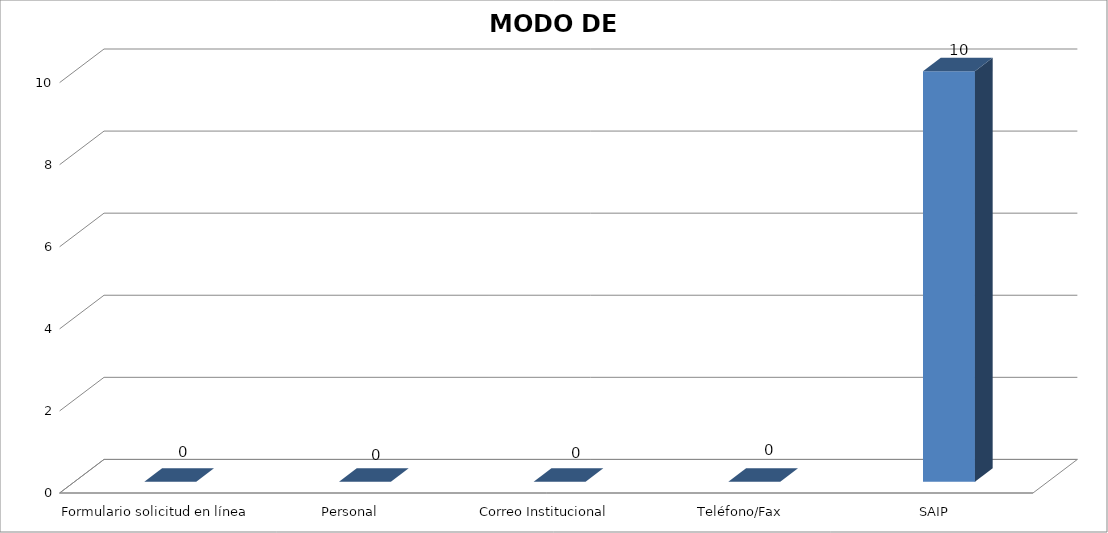
| Category | Series 0 | Series 1 | Series 2 |
|---|---|---|---|
| Formulario solicitud en línea |  | 0 |  |
| Personal |  | 0 |  |
| Correo Institucional |  | 0 |  |
| Teléfono/Fax |  | 0 |  |
| SAIP |  | 10 |  |